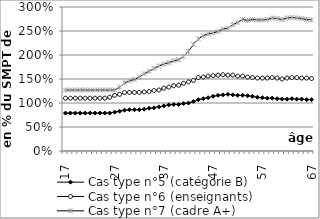
| Category | Cas type n°5 (catégorie B) | Cas type n°6 (enseignants) | Cas type n°7 (cadre A+) |
|---|---|---|---|
| 17.0 | 0.79 | 1.1 | 1.27 |
| 18.0 | 0.79 | 1.1 | 1.27 |
| 19.0 | 0.79 | 1.1 | 1.27 |
| 20.0 | 0.79 | 1.1 | 1.27 |
| 21.0 | 0.79 | 1.1 | 1.27 |
| 22.0 | 0.79 | 1.1 | 1.27 |
| 23.0 | 0.79 | 1.1 | 1.27 |
| 24.0 | 0.79 | 1.1 | 1.27 |
| 25.0 | 0.79 | 1.1 | 1.27 |
| 26.0 | 0.79 | 1.12 | 1.27 |
| 27.0 | 0.81 | 1.16 | 1.27 |
| 28.0 | 0.83 | 1.18 | 1.33 |
| 29.0 | 0.85 | 1.22 | 1.42 |
| 30.0 | 0.86 | 1.22 | 1.46 |
| 31.0 | 0.86 | 1.22 | 1.49 |
| 32.0 | 0.86 | 1.22 | 1.54 |
| 33.0 | 0.87 | 1.23 | 1.61 |
| 34.0 | 0.89 | 1.24 | 1.66 |
| 35.0 | 0.9 | 1.26 | 1.72 |
| 36.0 | 0.92 | 1.27 | 1.77 |
| 37.0 | 0.94 | 1.31 | 1.81 |
| 38.0 | 0.96 | 1.33 | 1.84 |
| 39.0 | 0.97 | 1.36 | 1.88 |
| 40.0 | 0.97 | 1.37 | 1.9 |
| 41.0 | 0.99 | 1.41 | 1.97 |
| 42.0 | 1 | 1.44 | 2.08 |
| 43.0 | 1.03 | 1.47 | 2.22 |
| 44.0 | 1.07 | 1.53 | 2.34 |
| 45.0 | 1.09 | 1.54 | 2.4 |
| 46.0 | 1.11 | 1.56 | 2.44 |
| 47.0 | 1.14 | 1.57 | 2.46 |
| 48.0 | 1.16 | 1.58 | 2.49 |
| 49.0 | 1.17 | 1.59 | 2.54 |
| 50.0 | 1.18 | 1.58 | 2.56 |
| 51.0 | 1.17 | 1.58 | 2.63 |
| 52.0 | 1.16 | 1.56 | 2.68 |
| 53.0 | 1.16 | 1.56 | 2.74 |
| 54.0 | 1.15 | 1.54 | 2.72 |
| 55.0 | 1.14 | 1.53 | 2.74 |
| 56.0 | 1.12 | 1.52 | 2.73 |
| 57.0 | 1.11 | 1.52 | 2.73 |
| 58.0 | 1.1 | 1.52 | 2.74 |
| 59.0 | 1.1 | 1.53 | 2.77 |
| 60.0 | 1.09 | 1.52 | 2.76 |
| 61.0 | 1.08 | 1.5 | 2.74 |
| 62.0 | 1.08 | 1.52 | 2.77 |
| 63.0 | 1.09 | 1.53 | 2.78 |
| 64.0 | 1.08 | 1.53 | 2.77 |
| 65.0 | 1.08 | 1.52 | 2.76 |
| 66.0 | 1.07 | 1.52 | 2.74 |
| 67.0 | 1.07 | 1.51 | 2.73 |